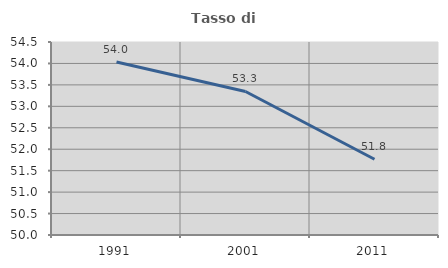
| Category | Tasso di occupazione   |
|---|---|
| 1991.0 | 54.032 |
| 2001.0 | 53.347 |
| 2011.0 | 51.766 |